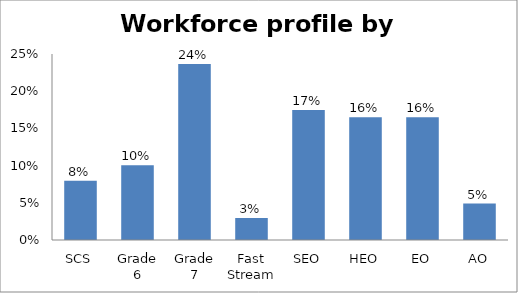
| Category | Series 0 |
|---|---|
| SCS | 0.08 |
| Grade 6 | 0.101 |
| Grade 7 | 0.236 |
| Fast Stream | 0.03 |
| SEO | 0.175 |
| HEO | 0.165 |
| EO | 0.165 |
| AO | 0.049 |